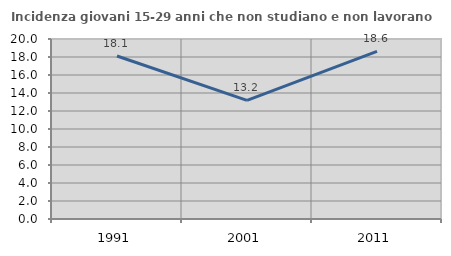
| Category | Incidenza giovani 15-29 anni che non studiano e non lavorano  |
|---|---|
| 1991.0 | 18.108 |
| 2001.0 | 13.186 |
| 2011.0 | 18.616 |